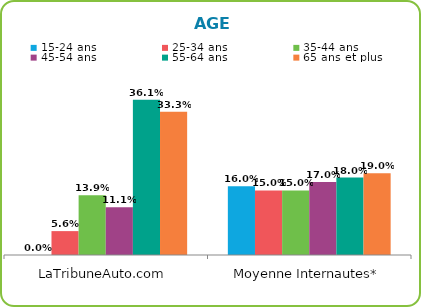
| Category | 15-24 ans | 25-34 ans | 35-44 ans | 45-54 ans | 55-64 ans | 65 ans et plus |
|---|---|---|---|---|---|---|
| LaTribuneAuto.com | 0 | 0.056 | 0.139 | 0.111 | 0.361 | 0.333 |
| Moyenne Internautes* | 0.16 | 0.15 | 0.15 | 0.17 | 0.18 | 0.19 |